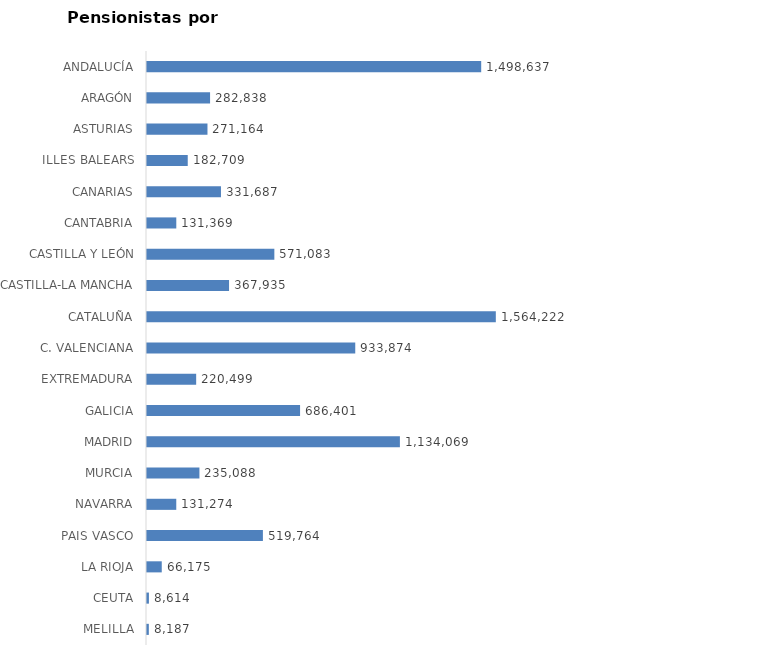
| Category | AMBOS SEXOS (1) |
|---|---|
| ANDALUCÍA | 1498637 |
| ARAGÓN | 282838 |
| ASTURIAS | 271164 |
| ILLES BALEARS | 182709 |
| CANARIAS | 331687 |
| CANTABRIA | 131369 |
| CASTILLA Y LEÓN | 571083 |
| CASTILLA-LA MANCHA | 367935 |
| CATALUÑA | 1564222 |
| C. VALENCIANA | 933874 |
| EXTREMADURA | 220499 |
| GALICIA | 686401 |
| MADRID | 1134069 |
| MURCIA | 235088 |
| NAVARRA | 131274 |
| PAIS VASCO | 519764 |
| LA RIOJA | 66175 |
| CEUTA | 8614 |
| MELILLA | 8187 |